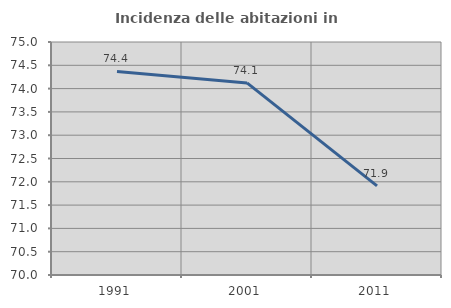
| Category | Incidenza delle abitazioni in proprietà  |
|---|---|
| 1991.0 | 74.368 |
| 2001.0 | 74.122 |
| 2011.0 | 71.913 |